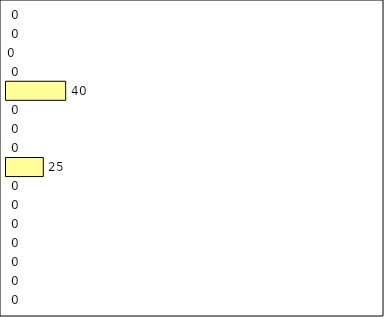
| Category | -2 | -1 | 0 | 1 | 2 | 3 | 4 | 5 | 6 | 7 | 8 | 9 | 10 | 11 | 12 | Perfect Round |
|---|---|---|---|---|---|---|---|---|---|---|---|---|---|---|---|---|
| 0 | 0 | 0 | 0 | 0 | 0 | 0 | 0 | 25 | 0 | 0 | 0 | 40 | 0 | 0 | 0 | 0 |